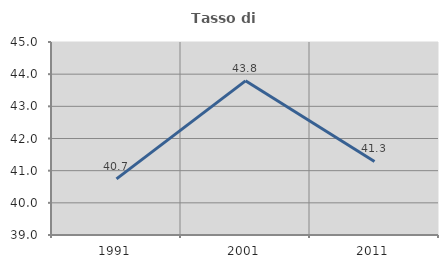
| Category | Tasso di occupazione   |
|---|---|
| 1991.0 | 40.747 |
| 2001.0 | 43.793 |
| 2011.0 | 41.286 |